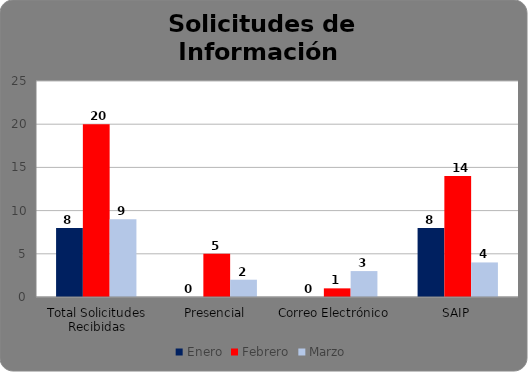
| Category | Enero | Febrero | Marzo |
|---|---|---|---|
| Total Solicitudes Recibidas | 8 | 20 | 9 |
| Presencial | 0 | 5 | 2 |
| Correo Electrónico  | 0 | 1 | 3 |
| SAIP | 8 | 14 | 4 |